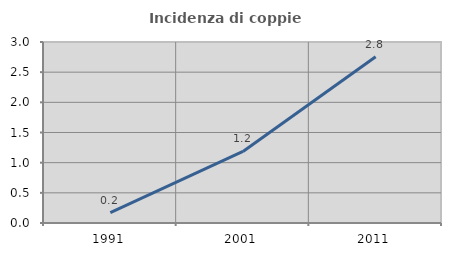
| Category | Incidenza di coppie miste |
|---|---|
| 1991.0 | 0.172 |
| 2001.0 | 1.186 |
| 2011.0 | 2.756 |